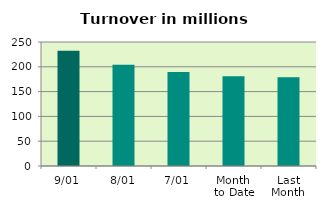
| Category | Series 0 |
|---|---|
| 9/01 | 232.387 |
| 8/01 | 204.323 |
| 7/01 | 189.766 |
| Month 
to Date | 180.988 |
| Last
Month | 179.047 |